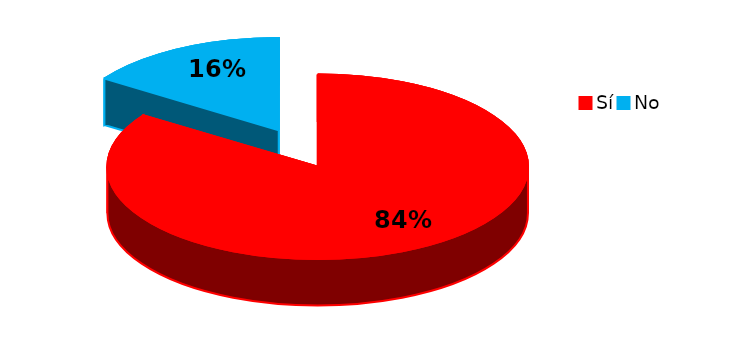
| Category | Series 0 |
|---|---|
| Sí | 228 |
| No | 42 |